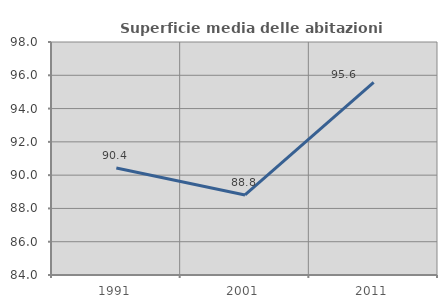
| Category | Superficie media delle abitazioni occupate |
|---|---|
| 1991.0 | 90.429 |
| 2001.0 | 88.81 |
| 2011.0 | 95.574 |